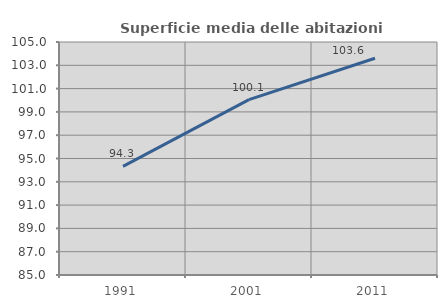
| Category | Superficie media delle abitazioni occupate |
|---|---|
| 1991.0 | 94.324 |
| 2001.0 | 100.053 |
| 2011.0 | 103.605 |